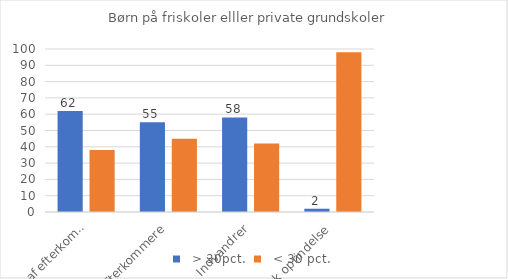
| Category | Series 0 | Series 1 |
|---|---|---|
| Børn af efterkommere | 62 | 38 |
| Efterkommere | 55 | 45 |
| Indvandrer | 58 | 42 |
| Dansk oprindelse | 2 | 98 |